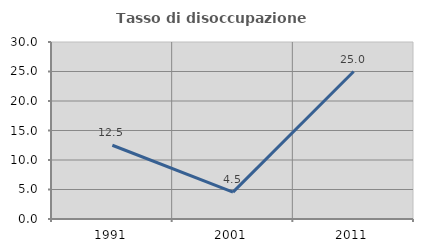
| Category | Tasso di disoccupazione giovanile  |
|---|---|
| 1991.0 | 12.5 |
| 2001.0 | 4.545 |
| 2011.0 | 25 |